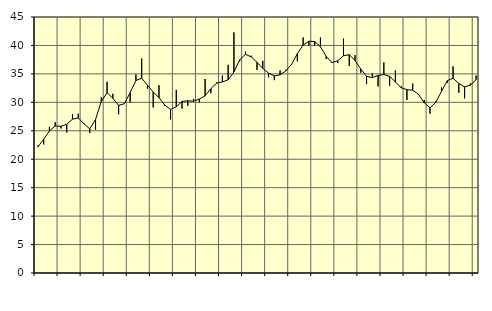
| Category | Piggar | Series 1 |
|---|---|---|
| nan | 22.4 | 22.18 |
| 1.0 | 22.6 | 23.5 |
| 1.0 | 25.7 | 24.96 |
| 1.0 | 26.5 | 25.84 |
| nan | 25.4 | 25.79 |
| 2.0 | 24.7 | 26.13 |
| 2.0 | 27.9 | 27.04 |
| 2.0 | 28 | 27.27 |
| nan | 26.3 | 26.22 |
| 3.0 | 24.6 | 25.34 |
| 3.0 | 25.2 | 26.99 |
| 3.0 | 30.9 | 30.15 |
| nan | 33.6 | 31.69 |
| 4.0 | 31.5 | 30.71 |
| 4.0 | 27.9 | 29.46 |
| 4.0 | 29.8 | 29.76 |
| nan | 30 | 31.71 |
| 5.0 | 34.9 | 33.84 |
| 5.0 | 37.7 | 34.23 |
| 5.0 | 32.4 | 33.02 |
| nan | 29.1 | 31.81 |
| 6.0 | 33 | 30.82 |
| 6.0 | 29.4 | 29.53 |
| 6.0 | 27 | 28.75 |
| nan | 32.2 | 29.22 |
| 7.0 | 28.9 | 30.16 |
| 7.0 | 29.4 | 30.27 |
| 7.0 | 30.6 | 30.2 |
| nan | 30 | 30.58 |
| 8.0 | 34.1 | 31.15 |
| 8.0 | 31.6 | 32.39 |
| 8.0 | 33.5 | 33.37 |
| nan | 34.7 | 33.58 |
| 9.0 | 36.6 | 33.97 |
| 9.0 | 42.3 | 35.34 |
| 9.0 | 37.2 | 37.48 |
| nan | 38.9 | 38.45 |
| 10.0 | 38.2 | 37.98 |
| 10.0 | 35.7 | 37.03 |
| 10.0 | 37.3 | 35.96 |
| nan | 34.4 | 35.14 |
| 11.0 | 33.9 | 34.65 |
| 11.0 | 35.6 | 34.84 |
| 11.0 | 35.7 | 35.53 |
| nan | 36.6 | 36.7 |
| 12.0 | 37.2 | 38.56 |
| 12.0 | 41.4 | 40.06 |
| 12.0 | 39.9 | 40.75 |
| nan | 40 | 40.68 |
| 13.0 | 41.4 | 39.78 |
| 13.0 | 37.6 | 38.09 |
| 13.0 | 37.1 | 36.99 |
| nan | 36.9 | 37.32 |
| 14.0 | 41.2 | 38.19 |
| 14.0 | 36.4 | 38.38 |
| 14.0 | 38.3 | 37.36 |
| nan | 35.2 | 35.85 |
| 15.0 | 33.2 | 34.58 |
| 15.0 | 35.1 | 34.32 |
| 15.0 | 32.8 | 34.73 |
| nan | 37 | 34.88 |
| 16.0 | 32.9 | 34.56 |
| 16.0 | 35.6 | 33.59 |
| 16.0 | 32.8 | 32.57 |
| nan | 30.4 | 32.22 |
| 17.0 | 33.3 | 32.14 |
| 17.0 | 31.3 | 31.42 |
| 17.0 | 30.4 | 29.92 |
| nan | 28 | 29.04 |
| 18.0 | 30.2 | 29.99 |
| 18.0 | 32.6 | 31.95 |
| 18.0 | 33.4 | 33.81 |
| nan | 36.3 | 34.24 |
| 19.0 | 31.7 | 33.31 |
| 19.0 | 30.7 | 32.71 |
| 19.0 | 33.3 | 33.03 |
| nan | 34.7 | 33.97 |